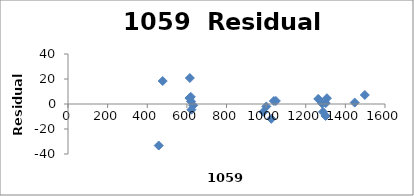
| Category | Series 0 |
|---|---|
| 1049.0 | 2.458 |
| 1039.0 | 2.411 |
| 1026.0 | -11.854 |
| 1001.0 | -1.95 |
| 986.0 | -6.243 |
| 1447.0 | 1.138 |
| 458.0 | -33.233 |
| 1263.0 | 4.068 |
| 1283.0 | 0.394 |
| 1301.0 | 0.749 |
| 1287.0 | -6.305 |
| 1300.0 | -9.536 |
| 1307.0 | 4.636 |
| 632.0 | -1.102 |
| 621.0 | 2.113 |
| 623.0 | -4.571 |
| 620.0 | 5.703 |
| 613.0 | 4.746 |
| 615.0 | 20.797 |
| 478.0 | 18.365 |
| 1498.0 | 7.221 |